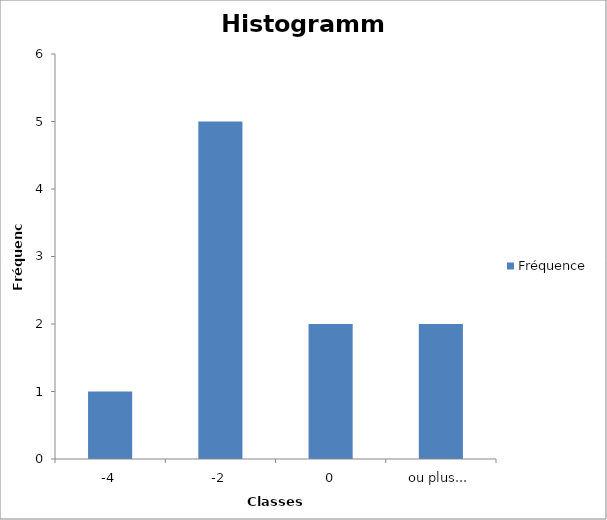
| Category | Fréquence |
|---|---|
| -4 | 1 |
| -2 | 5 |
| 0 | 2 |
| ou plus... | 2 |